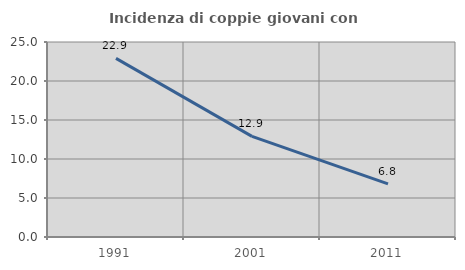
| Category | Incidenza di coppie giovani con figli |
|---|---|
| 1991.0 | 22.903 |
| 2001.0 | 12.901 |
| 2011.0 | 6.82 |